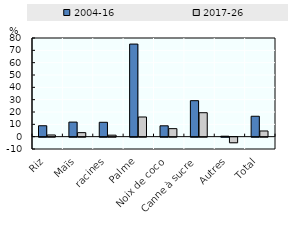
| Category | 2004-16 | 2017-26 |
|---|---|---|
| Riz | 8.86 | 1.373 |
| Maïs | 11.808 | 3.257 |
| racines | 11.663 | 1.219 |
| Palme | 75.076 | 15.958 |
| Noix de coco | 8.804 | 6.502 |
| Canne à sucre | 29.178 | 19.418 |
| Autres | 0.372 | -4.552 |
| Total | 16.548 | 4.613 |